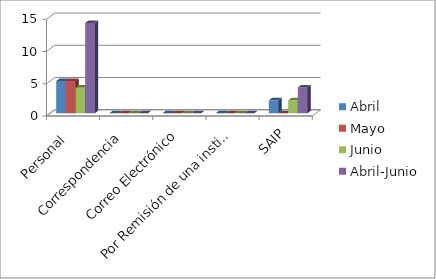
| Category | Abril | Mayo | Junio | Abril-Junio |
|---|---|---|---|---|
| Personal  | 5 | 5 | 4 | 14 |
| Correspondencia | 0 | 0 | 0 | 0 |
| Correo Electrónico | 0 | 0 | 0 | 0 |
| Por Remisión de una institución | 0 | 0 | 0 | 0 |
| SAIP | 2 | 0 | 2 | 4 |